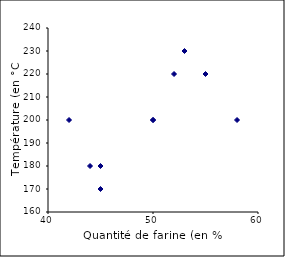
| Category | Series 0 |
|---|---|
| 50.0 | 200 |
| 45.0 | 180 |
| 52.0 | 220 |
| 44.0 | 180 |
| 55.0 | 220 |
| 58.0 | 200 |
| 42.0 | 200 |
| 50.0 | 200 |
| 53.0 | 230 |
| 45.0 | 170 |